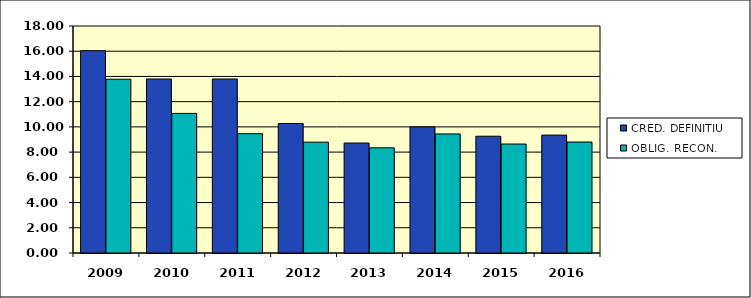
| Category | CRED. DEFINITIU | OBLIG. RECON. |
|---|---|---|
| 2009.0 | 16.04 | 13.78 |
| 2010.0 | 13.8 | 11.07 |
| 2011.0 | 13.8 | 9.46 |
| 2012.0 | 10.27 | 8.79 |
| 2013.0 | 8.72 | 8.34 |
| 2014.0 | 10 | 9.44 |
| 2015.0 | 9.26 | 8.64 |
| 2016.0 | 9.35 | 8.8 |